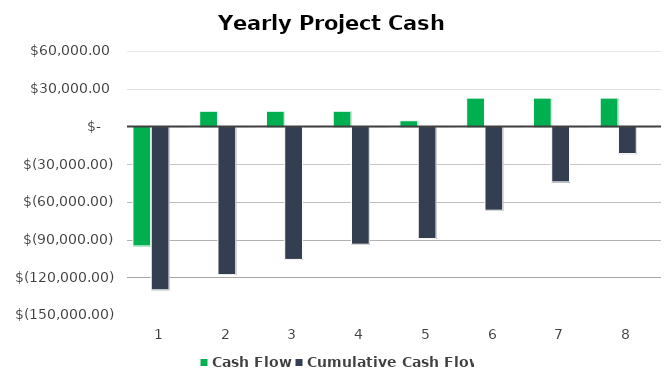
| Category | Cash Flow | Cumulative Cash Flow | Series 2 |
|---|---|---|---|
| 0 | -94660 | -129560 | 1 |
| 1 | 12080 | -117480 | 2 |
| 2 | 12080 | -105400 | 3 |
| 3 | 12080 | -93320 | 4 |
| 4 | 4532 | -88788 | 5 |
| 5 | 22532 | -66256 | 6 |
| 6 | 22532 | -43724 | 7 |
| 7 | 22532 | -21192 | 8 |